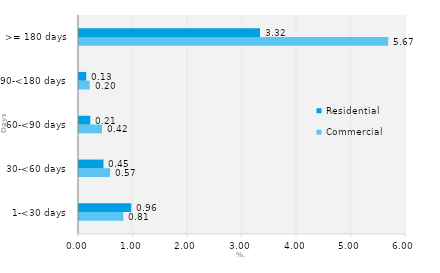
| Category | Commercial | Residential |
|---|---|---|
| 1-<30 days | 0.813 | 0.959 |
| 30-<60 days | 0.571 | 0.449 |
| 60-<90 days | 0.422 | 0.207 |
| 90-<180 days | 0.197 | 0.133 |
| >= 180 days | 5.674 | 3.32 |